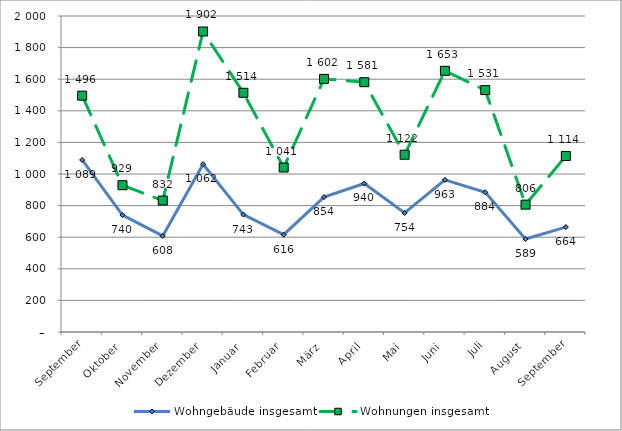
| Category | Wohngebäude insgesamt | Wohnungen insgesamt |
|---|---|---|
| September | 1089 | 1496 |
| Oktober | 740 | 929 |
| November | 608 | 832 |
| Dezember | 1062 | 1902 |
| Januar | 743 | 1514 |
| Februar | 616 | 1041 |
| März | 854 | 1602 |
| April | 940 | 1581 |
| Mai | 754 | 1122 |
| Juni | 963 | 1653 |
| Juli | 884 | 1531 |
| August | 589 | 806 |
| September | 664 | 1114 |